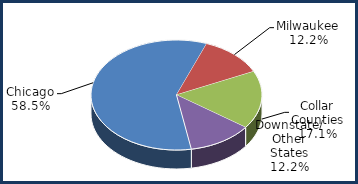
| Category | Series 0 |
|---|---|
| Chicago | 0.585 |
| Milwaukee | 0.122 |
| Collar Counties | 0.171 |
| Downstate/ Other States | 0.122 |